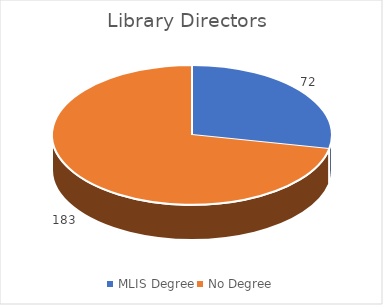
| Category | Series 0 |
|---|---|
| MLIS Degree | 72 |
| No Degree | 183 |